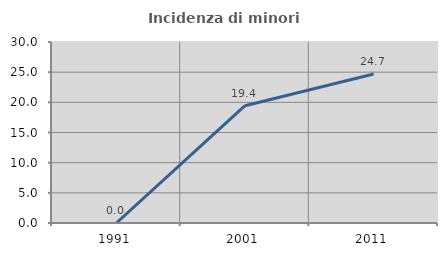
| Category | Incidenza di minori stranieri |
|---|---|
| 1991.0 | 0 |
| 2001.0 | 19.444 |
| 2011.0 | 24.686 |